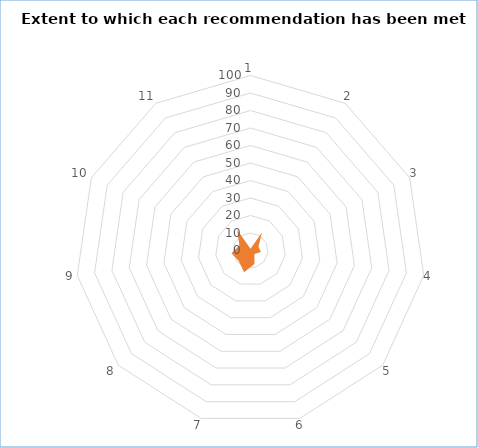
| Category | Series 1 | Series 0 |
|---|---|---|
| 0 | 1 | 0 |
| 1 | 12 | 0 |
| 2 | 5 | 0 |
| 3 | 6 | 0 |
| 4 | 3 | 0 |
| 5 | 8 | 0 |
| 6 | 13 | 0 |
| 7 | 9 | 0 |
| 8 | 11 | 0 |
| 9 | 7 | 0 |
| 10 | 14 | 0 |